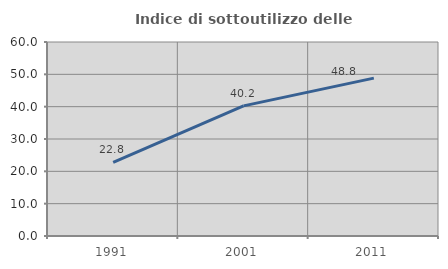
| Category | Indice di sottoutilizzo delle abitazioni  |
|---|---|
| 1991.0 | 22.785 |
| 2001.0 | 40.244 |
| 2011.0 | 48.837 |